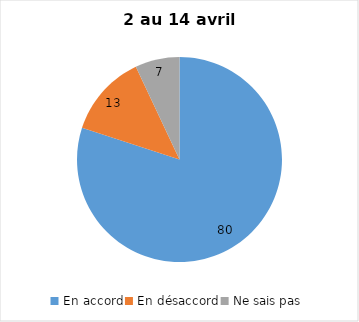
| Category | Series 0 |
|---|---|
| En accord | 80 |
| En désaccord | 13 |
| Ne sais pas | 7 |